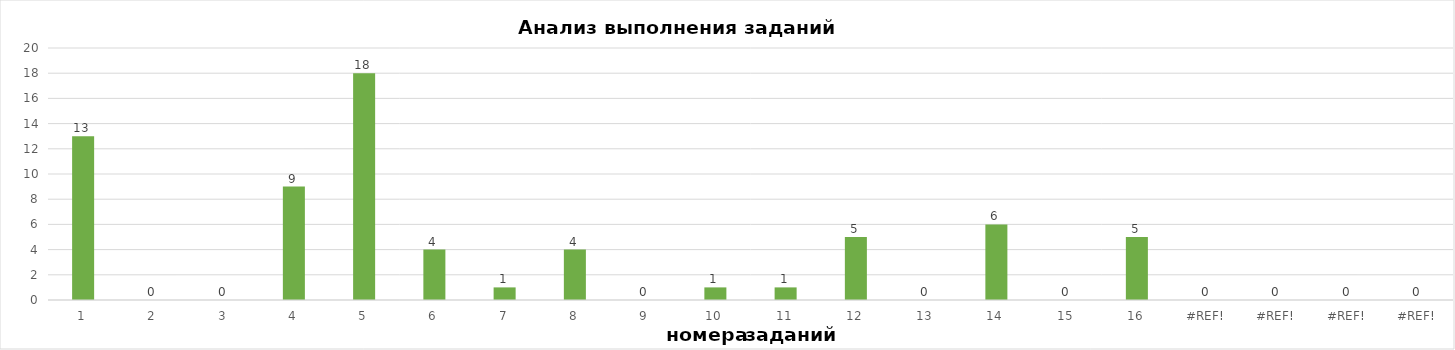
| Category | задания |
|---|---|
| 1.0 | 13 |
| 2.0 | 0 |
| 3.0 | 0 |
| 4.0 | 9 |
| 5.0 | 18 |
| 6.0 | 4 |
| 7.0 | 1 |
| 8.0 | 4 |
| 9.0 | 0 |
| 10.0 | 1 |
| 11.0 | 1 |
| 12.0 | 5 |
| 13.0 | 0 |
| 14.0 | 6 |
| 15.0 | 0 |
| 16.0 | 5 |
| 0.0 | 0 |
| 0.0 | 0 |
| 0.0 | 0 |
| 0.0 | 0 |